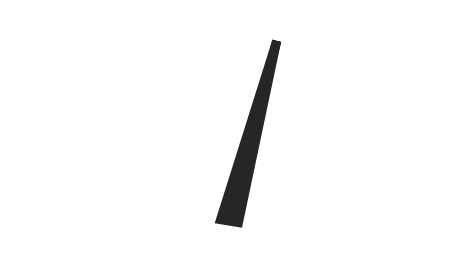
| Category | y |
|---|---|
| 60.293130438494074 | 48.929 |
| 51.957161808650945 | -0.412 |
| 48.042838191349055 | 0.412 |
| 60.293130438494074 | 48.929 |
| 50.0 | 0 |